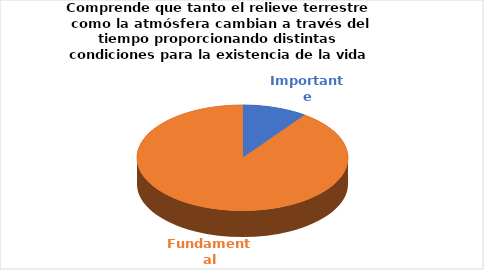
| Category | Series 0 |
|---|---|
| Importante | 1 |
| Fundamental | 9 |